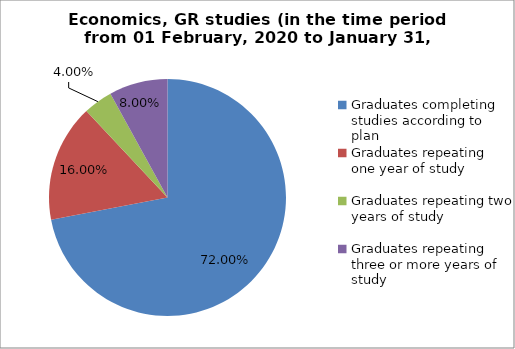
| Category | Series 0 |
|---|---|
| Graduates completing studies according to plan | 72 |
| Graduates repeating one year of study | 16 |
| Graduates repeating two years of study | 4 |
| Graduates repeating three or more years of study | 8 |